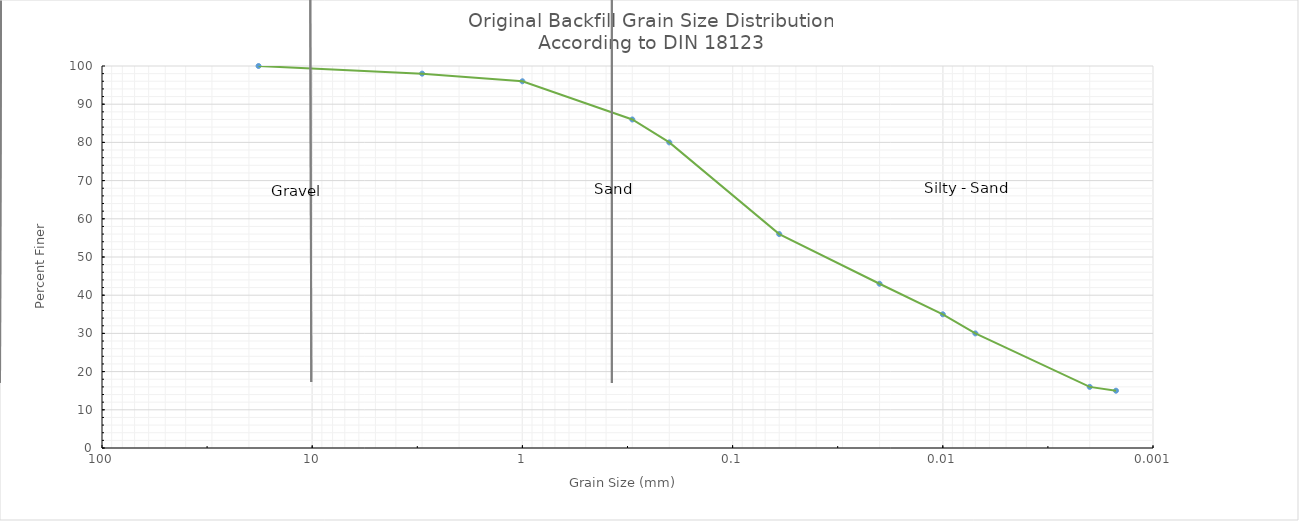
| Category | Series 4 |
|---|---|
| 18.0 | 100 |
| 3.0 | 98 |
| 1.0 | 96 |
| 0.3 | 86 |
| 0.2 | 80 |
| 0.06 | 56 |
| 0.02 | 43 |
| 0.01 | 35 |
| 0.007 | 30 |
| 0.002 | 16 |
| 0.0015 | 15 |